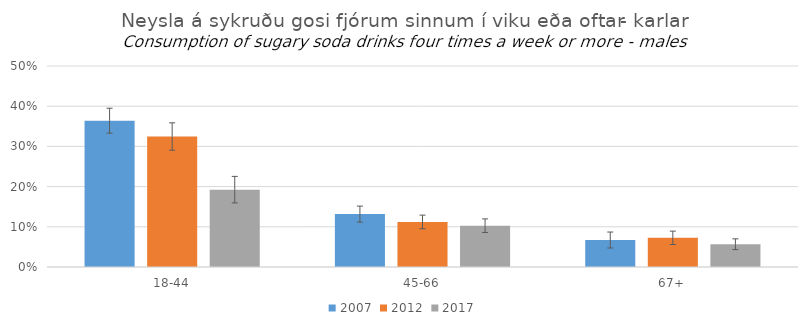
| Category | 2007 | 2012 | 2017 |
|---|---|---|---|
| 18-44 | 0.364 | 0.325 | 0.192 |
| 45-66 | 0.132 | 0.112 | 0.103 |
| 67+ | 0.067 | 0.073 | 0.057 |